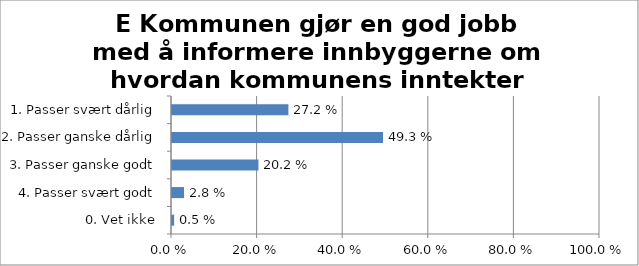
| Category | E Kommunen gjør en god jobb med å informere innbyggerne om hvordan kommunens inntekter brukes |
|---|---|
| 1. Passer svært dårlig | 0.272 |
| 2. Passer ganske dårlig | 0.493 |
| 3. Passer ganske godt | 0.202 |
| 4. Passer svært godt | 0.028 |
| 0. Vet ikke | 0.005 |